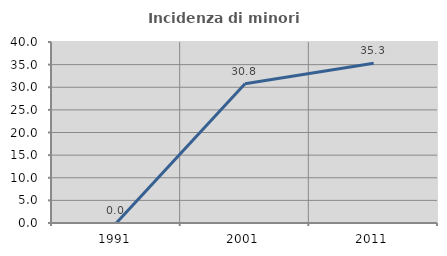
| Category | Incidenza di minori stranieri |
|---|---|
| 1991.0 | 0 |
| 2001.0 | 30.769 |
| 2011.0 | 35.294 |